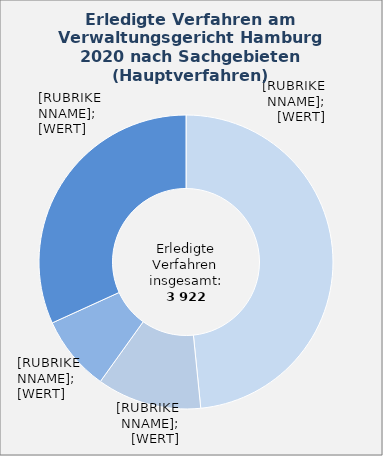
| Category | in Prozent |
|---|---|
| Asylrecht – Hauptsacheverfahren (Asylrecht, Verteilung von Asylbewerbenden) | 48.4 |
| Ausländerrecht | 11.5 |
| Recht des öffentlichen Dienstes | 8.3 |
| Übrige Sachgebiete¹ | 31.8 |